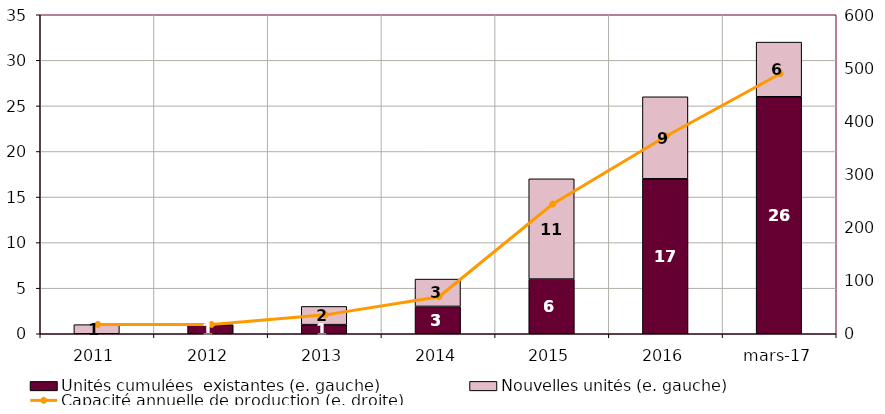
| Category | Unités cumulées  existantes (e. gauche) | Nouvelles unités (e. gauche) |
|---|---|---|
| 2011.0 | 0 | 1 |
| 2012.0 | 1 | 0 |
| 2013.0 | 1 | 2 |
| 2014.0 | 3 | 3 |
| 2015.0 | 6 | 11 |
| 2016.0 | 17 | 9 |
| 42795.0 | 26 | 6 |